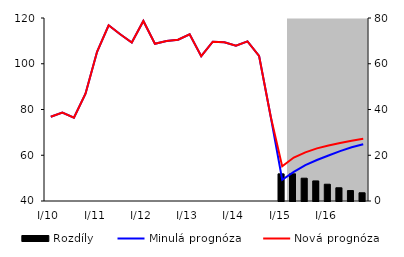
| Category | Rozdíly |
|---|---|
| 0 | 0 |
| 1 | 0 |
| 2 | 0 |
| 3 | 0 |
| 4 | 0 |
| 5 | 0 |
| 6 | 0 |
| 7 | 0 |
| 8 | 0 |
| 9 | 0 |
| 10 | 0 |
| 11 | 0 |
| 12 | 0 |
| 13 | 0 |
| 14 | 0 |
| 15 | 0 |
| 16 | 0 |
| 17 | 0 |
| 18 | 0 |
| 19 | 0 |
| 20 | 11.866 |
| 21 | 11.878 |
| 22 | 9.97 |
| 23 | 8.782 |
| 24 | 7.334 |
| 25 | 5.78 |
| 26 | 4.564 |
| 27 | 3.598 |